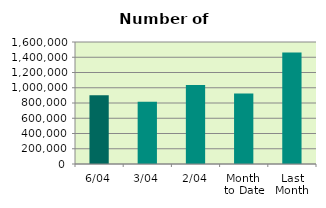
| Category | Series 0 |
|---|---|
| 6/04 | 900520 |
| 3/04 | 817132 |
| 2/04 | 1035666 |
| Month 
to Date | 923657.5 |
| Last
Month | 1462822.818 |